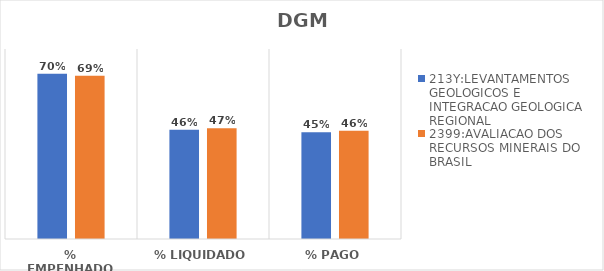
| Category | 213Y:LEVANTAMENTOS GEOLOGICOS E INTEGRACAO GEOLOGICA REGIONAL | 2399:AVALIACAO DOS RECURSOS MINERAIS DO BRASIL |
|---|---|---|
| % EMPENHADO | 0.695 | 0.687 |
| % LIQUIDADO | 0.46 | 0.466 |
| % PAGO | 0.45 | 0.455 |